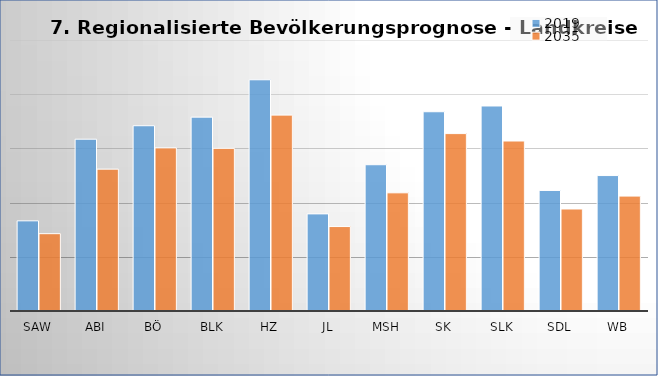
| Category | 2019 | 2035 |
|---|---|---|
| SAW | 83173 | 71322 |
| ABI | 158486 | 130870 |
| BÖ | 170923 | 150481 |
| BLK | 178846 | 150047 |
| HZ | 213310 | 180700 |
| JL | 89589 | 77896 |
| MSH | 134942 | 109018 |
| SK | 183815 | 163653 |
| SLK | 189125 | 156820 |
| SDL | 111190 | 94099 |
| WB | 124953 | 106011 |